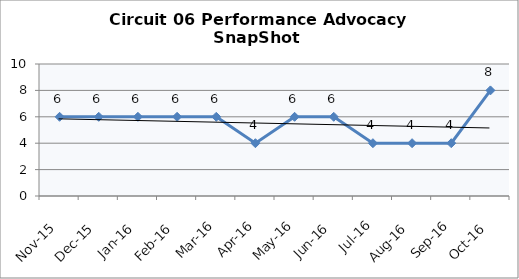
| Category | Circuit 06 |
|---|---|
| Nov-15 | 6 |
| Dec-15 | 6 |
| Jan-16 | 6 |
| Feb-16 | 6 |
| Mar-16 | 6 |
| Apr-16 | 4 |
| May-16 | 6 |
| Jun-16 | 6 |
| Jul-16 | 4 |
| Aug-16 | 4 |
| Sep-16 | 4 |
| Oct-16 | 8 |